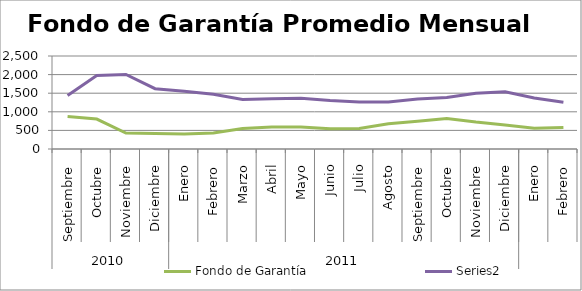
| Category | Fondo de Garantía | Series 3 |
|---|---|---|
| 0 | 871.43 | 1439.553 |
| 1 | 804.208 | 1973.732 |
| 2 | 428.758 | 2004.096 |
| 3 | 417.974 | 1620.905 |
| 4 | 403.651 | 1555.632 |
| 5 | 429.02 | 1474.054 |
| 6 | 551.344 | 1328.521 |
| 7 | 591.732 | 1351.463 |
| 8 | 591.784 | 1363.301 |
| 9 | 544.875 | 1304.985 |
| 10 | 551.606 | 1265.502 |
| 11 | 679.839 | 1266.018 |
| 12 | 747.74 | 1344.929 |
| 13 | 819.75 | 1383.171 |
| 14 | 723.635 | 1501.378 |
| 15 | 648.288 | 1537.485 |
| 16 | 560.173 | 1370.992 |
| 17 | 575.916 | 1258.831 |